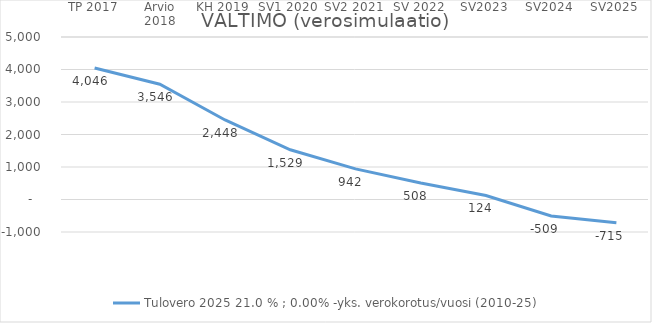
| Category | Tulovero 2025 |
|---|---|
| TP 2017 | 4046 |
| Arvio 2018 | 3546 |
| KH 2019 | 2447.891 |
| SV1 2020 | 1529.358 |
| SV2 2021 | 941.984 |
| SV 2022 | 507.917 |
| SV2023 | 124.443 |
| SV2024 | -509.017 |
| SV2025 | -714.504 |